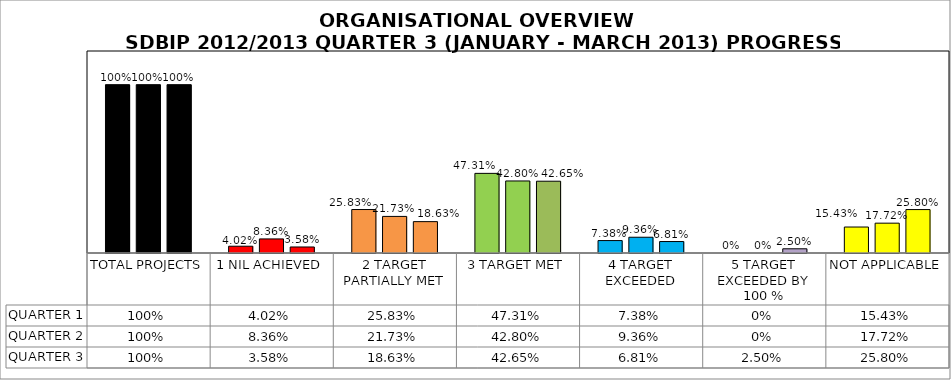
| Category | QUARTER 1 | QUARTER 2 | QUARTER 3 |
|---|---|---|---|
| TOTAL PROJECTS | 1 | 1 | 1 |
| 1 NIL ACHIEVED | 0.04 | 0.084 | 0.036 |
| 2 TARGET PARTIALLY MET | 0.258 | 0.217 | 0.186 |
| 3 TARGET MET | 0.473 | 0.428 | 0.426 |
| 4 TARGET EXCEEDED | 0.074 | 0.094 | 0.068 |
| 5 TARGET EXCEEDED BY 100 % | 0 | 0 | 0.025 |
| NOT APPLICABLE | 0.154 | 0.177 | 0.258 |